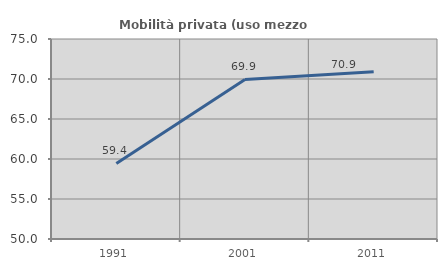
| Category | Mobilità privata (uso mezzo privato) |
|---|---|
| 1991.0 | 59.445 |
| 2001.0 | 69.948 |
| 2011.0 | 70.891 |